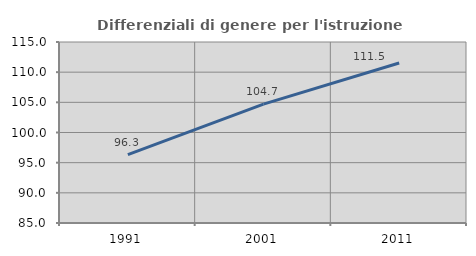
| Category | Differenziali di genere per l'istruzione superiore |
|---|---|
| 1991.0 | 96.334 |
| 2001.0 | 104.706 |
| 2011.0 | 111.51 |